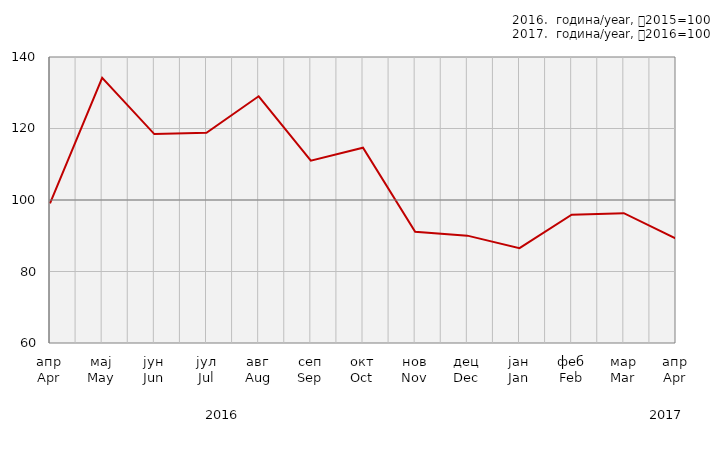
| Category | Индекси ноћења туриста
Tourist night indices |
|---|---|
| апр
Apr | 99.062 |
| мај
May | 134.186 |
| јун
Jun | 118.44 |
| јул
Jul | 118.819 |
| авг
Aug | 129.021 |
| сеп
Sep | 111.019 |
| окт
Oct | 114.634 |
| нов
Nov | 91.14 |
| дец
Dec | 90.034 |
| јан
Jan | 86.514 |
| феб
Feb | 95.907 |
| мар
Mar | 96.311 |
| апр
Apr | 89.193 |